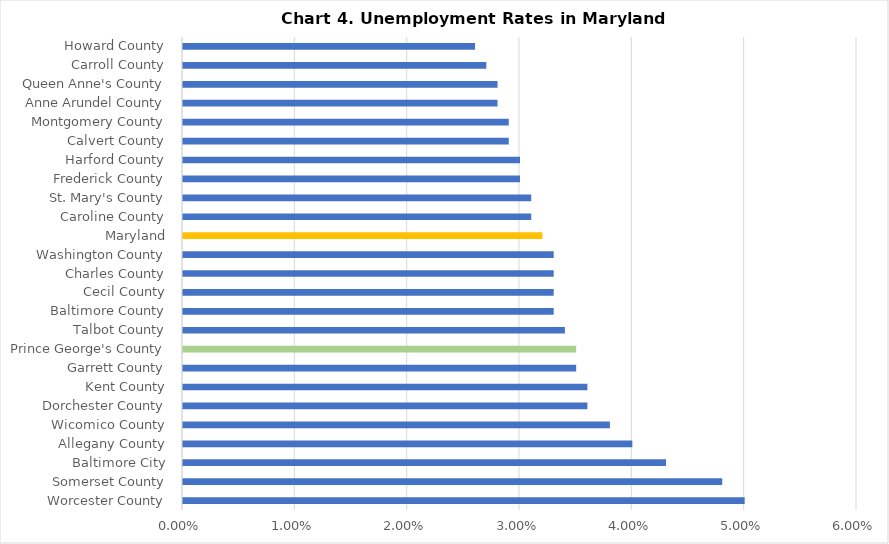
| Category | Series 0 |
|---|---|
| Worcester County | 0.05 |
| Somerset County | 0.048 |
| Baltimore City | 0.043 |
| Allegany County | 0.04 |
| Wicomico County | 0.038 |
| Dorchester County | 0.036 |
| Kent County | 0.036 |
| Garrett County | 0.035 |
| Prince George's County | 0.035 |
| Talbot County | 0.034 |
| Baltimore County | 0.033 |
| Cecil County | 0.033 |
| Charles County | 0.033 |
| Washington County | 0.033 |
| Maryland | 0.032 |
| Caroline County | 0.031 |
| St. Mary's County | 0.031 |
| Frederick County | 0.03 |
| Harford County | 0.03 |
| Calvert County | 0.029 |
| Montgomery County | 0.029 |
| Anne Arundel County | 0.028 |
| Queen Anne's County | 0.028 |
| Carroll County | 0.027 |
| Howard County | 0.026 |